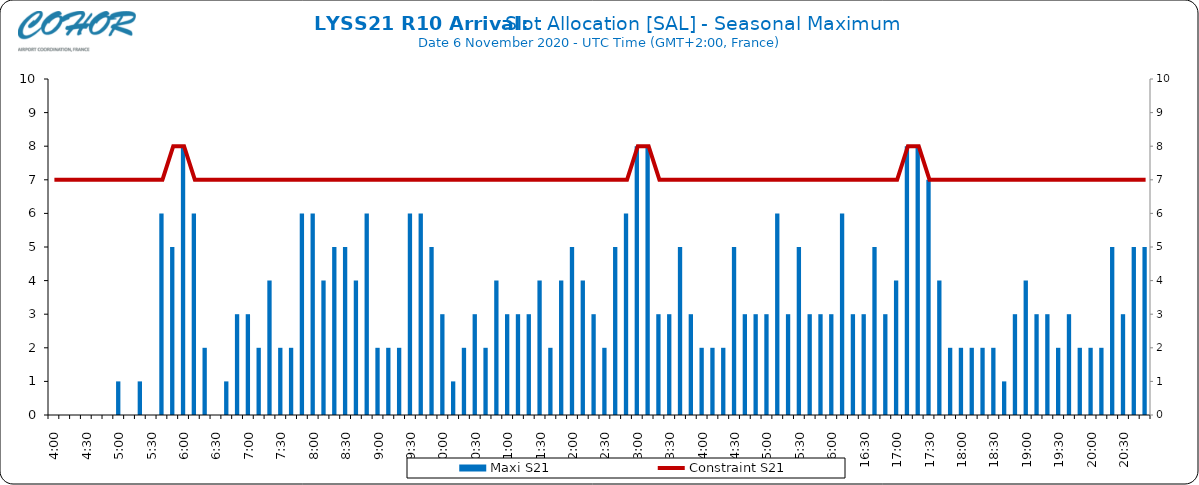
| Category | Maxi S21 |
|---|---|
| 0.16666666666666666 | 0 |
| 0.17361111111111113 | 0 |
| 0.18055555555555555 | 0 |
| 0.1875 | 0 |
| 0.19444444444444445 | 0 |
| 0.20138888888888887 | 0 |
| 0.20833333333333334 | 1 |
| 0.2152777777777778 | 0 |
| 0.2222222222222222 | 1 |
| 0.22916666666666666 | 0 |
| 0.23611111111111113 | 6 |
| 0.24305555555555555 | 5 |
| 0.25 | 8 |
| 0.2569444444444445 | 6 |
| 0.2638888888888889 | 2 |
| 0.2708333333333333 | 0 |
| 0.2777777777777778 | 1 |
| 0.2847222222222222 | 3 |
| 0.2916666666666667 | 3 |
| 0.2986111111111111 | 2 |
| 0.3055555555555555 | 4 |
| 0.3125 | 2 |
| 0.3194444444444445 | 2 |
| 0.3263888888888889 | 6 |
| 0.3333333333333333 | 6 |
| 0.34027777777777773 | 4 |
| 0.34722222222222227 | 5 |
| 0.3541666666666667 | 5 |
| 0.3611111111111111 | 4 |
| 0.3680555555555556 | 6 |
| 0.375 | 2 |
| 0.3819444444444444 | 2 |
| 0.3888888888888889 | 2 |
| 0.3958333333333333 | 6 |
| 0.40277777777777773 | 6 |
| 0.40972222222222227 | 5 |
| 0.4166666666666667 | 3 |
| 0.4236111111111111 | 1 |
| 0.4305555555555556 | 2 |
| 0.4375 | 3 |
| 0.4444444444444444 | 2 |
| 0.4513888888888889 | 4 |
| 0.4583333333333333 | 3 |
| 0.46527777777777773 | 3 |
| 0.47222222222222227 | 3 |
| 0.4791666666666667 | 4 |
| 0.4861111111111111 | 2 |
| 0.4930555555555556 | 4 |
| 0.5 | 5 |
| 0.5069444444444444 | 4 |
| 0.513888888888889 | 3 |
| 0.5208333333333334 | 2 |
| 0.5277777777777778 | 5 |
| 0.5347222222222222 | 6 |
| 0.5416666666666666 | 8 |
| 0.548611111111111 | 8 |
| 0.5555555555555556 | 3 |
| 0.5625 | 3 |
| 0.5694444444444444 | 5 |
| 0.576388888888889 | 3 |
| 0.5833333333333334 | 2 |
| 0.5902777777777778 | 2 |
| 0.5972222222222222 | 2 |
| 0.6041666666666666 | 5 |
| 0.611111111111111 | 3 |
| 0.6180555555555556 | 3 |
| 0.625 | 3 |
| 0.6319444444444444 | 6 |
| 0.638888888888889 | 3 |
| 0.6458333333333334 | 5 |
| 0.6527777777777778 | 3 |
| 0.6597222222222222 | 3 |
| 0.6666666666666666 | 3 |
| 0.6736111111111112 | 6 |
| 0.6805555555555555 | 3 |
| 0.6875 | 3 |
| 0.6944444444444445 | 5 |
| 0.7013888888888888 | 3 |
| 0.7083333333333334 | 4 |
| 0.7152777777777778 | 8 |
| 0.7222222222222222 | 8 |
| 0.7291666666666666 | 7 |
| 0.7361111111111112 | 4 |
| 0.7430555555555555 | 2 |
| 0.75 | 2 |
| 0.7569444444444445 | 2 |
| 0.7638888888888888 | 2 |
| 0.7708333333333334 | 2 |
| 0.7777777777777778 | 1 |
| 0.7847222222222222 | 3 |
| 0.7916666666666666 | 4 |
| 0.7986111111111112 | 3 |
| 0.8055555555555555 | 3 |
| 0.8125 | 2 |
| 0.8194444444444445 | 3 |
| 0.8263888888888888 | 2 |
| 0.8333333333333334 | 2 |
| 0.8402777777777778 | 2 |
| 0.8472222222222222 | 5 |
| 0.8541666666666666 | 3 |
| 0.8611111111111112 | 5 |
| 0.8680555555555555 | 5 |